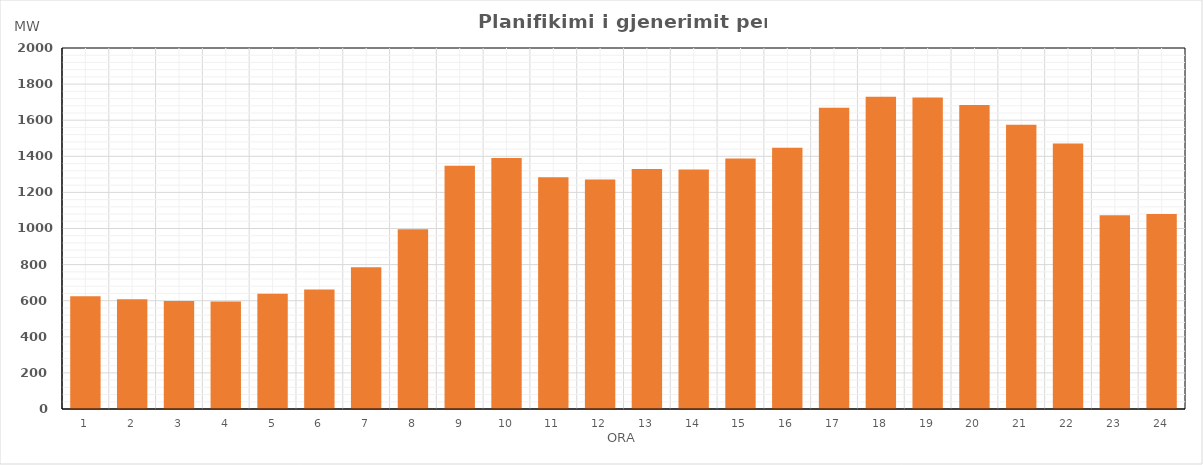
| Category | Max (MW) |
|---|---|
| 0 | 624.186 |
| 1 | 608.496 |
| 2 | 597.905 |
| 3 | 596.18 |
| 4 | 638.085 |
| 5 | 662.352 |
| 6 | 785.545 |
| 7 | 995.866 |
| 8 | 1348.003 |
| 9 | 1390.398 |
| 10 | 1283.768 |
| 11 | 1271.463 |
| 12 | 1329.141 |
| 13 | 1327.504 |
| 14 | 1387.516 |
| 15 | 1447.801 |
| 16 | 1669.283 |
| 17 | 1729.235 |
| 18 | 1725.704 |
| 19 | 1684.576 |
| 20 | 1574.532 |
| 21 | 1470.365 |
| 22 | 1073.118 |
| 23 | 1079.833 |